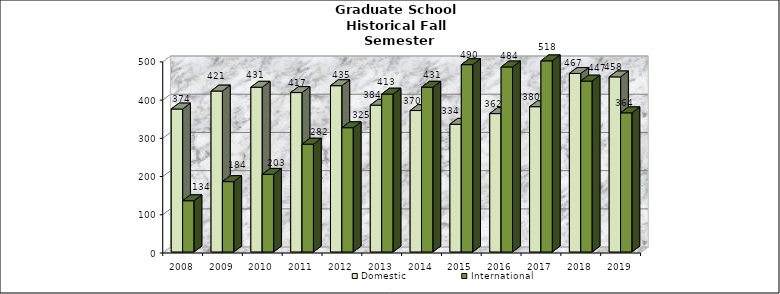
| Category | Domestic | International |
|---|---|---|
| 2008.0 | 374 | 134 |
| 2009.0 | 421 | 184 |
| 2010.0 | 431 | 203 |
| 2011.0 | 417 | 282 |
| 2012.0 | 435 | 325 |
| 2013.0 | 384 | 413 |
| 2014.0 | 370 | 431 |
| 2015.0 | 334 | 490 |
| 2016.0 | 362 | 484 |
| 2017.0 | 380 | 518 |
| 2018.0 | 467 | 447 |
| 2019.0 | 458 | 364 |